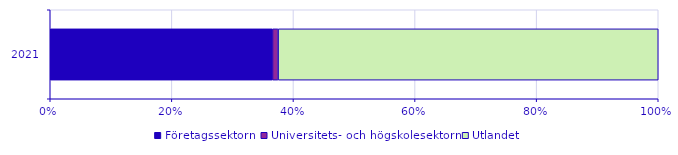
| Category | Företagssektorn | Universitets- och högskolesektorn | Utlandet |
|---|---|---|---|
| 2021.0 | 24120 | 612 | 41252 |